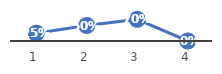
| Category | Series 0 |
|---|---|
| 0 | 0.25 |
| 1 | 0.5 |
| 2 | 0.7 |
| 3 | 0 |